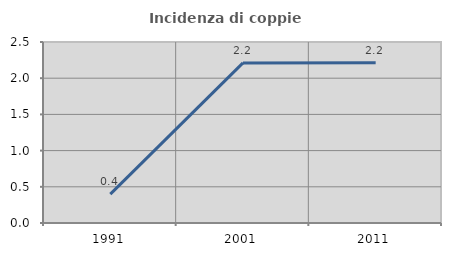
| Category | Incidenza di coppie miste |
|---|---|
| 1991.0 | 0.399 |
| 2001.0 | 2.211 |
| 2011.0 | 2.214 |